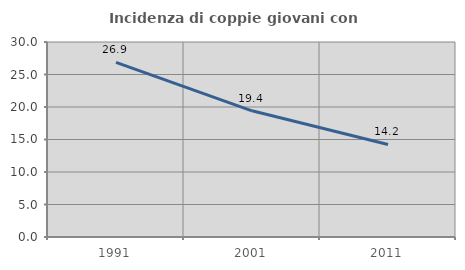
| Category | Incidenza di coppie giovani con figli |
|---|---|
| 1991.0 | 26.866 |
| 2001.0 | 19.414 |
| 2011.0 | 14.231 |